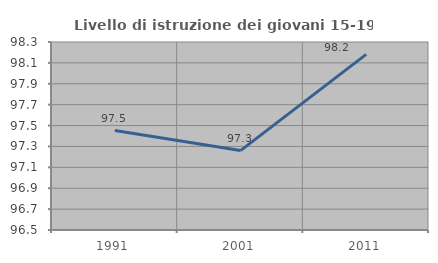
| Category | Livello di istruzione dei giovani 15-19 anni |
|---|---|
| 1991.0 | 97.452 |
| 2001.0 | 97.26 |
| 2011.0 | 98.182 |